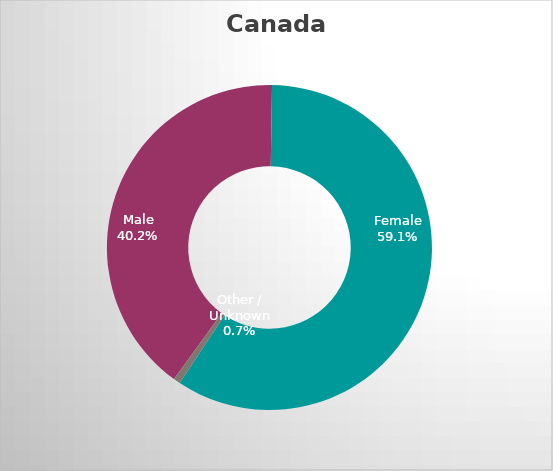
| Category | Canada |
|---|---|
| Male | 0.402 |
| Female | 0.591 |
| Other / Unknown | 0.007 |